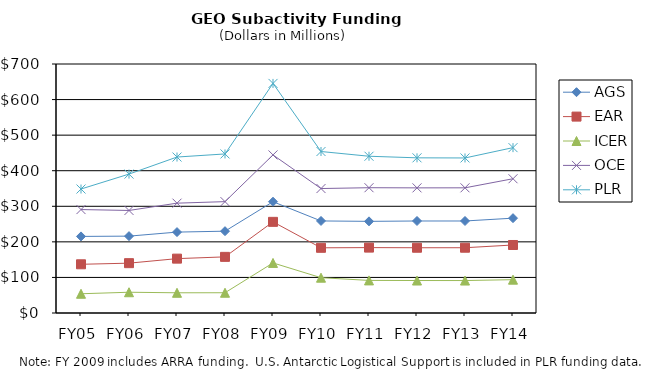
| Category | AGS | EAR | ICER | OCE | PLR |
|---|---|---|---|---|---|
| FY05 | 215.32 | 136.95 | 54.11 | 290.79 | 348.53 |
| FY06 | 216.09 | 140.12 | 58.37 | 288.25 | 390.54 |
| FY07 | 227.44 | 152.83 | 56.82 | 308.76 | 438.43 |
| FY08 | 230.03 | 157.82 | 56.96 | 313.06 | 447.13 |
| FY09 | 312.8 | 256.22 | 140.75 | 444.36 | 645.44 |
| FY10 | 258.8 | 183.26 | 99.27 | 349.88 | 453.996 |
| FY11 | 257.654 | 183.834 | 91.619 | 352.213 | 440.7 |
| FY12 | 258.646 | 183.434 | 91.301 | 351.795 | 436.197 |
| FY13 | 258.66 | 183.5 | 91.21 | 351.9 | 435.87 |
| FY14 | 266.61 | 191.2 | 93.71 | 377.44 | 464.9 |